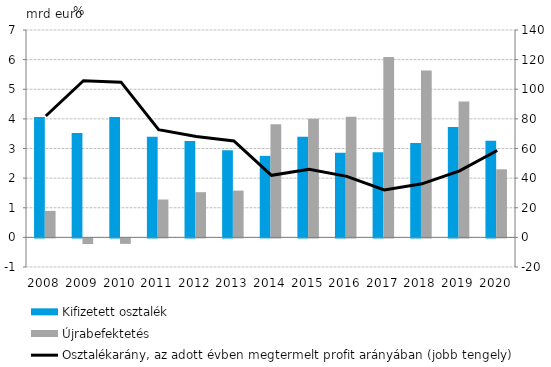
| Category | Kifizetett osztalék | Újrabefektetés |
|---|---|---|
| 2008.0 | 4.064 | 0.895 |
| 2009.0 | 3.522 | -0.192 |
| 2010.0 | 4.061 | -0.186 |
| 2011.0 | 3.399 | 1.278 |
| 2012.0 | 3.253 | 1.525 |
| 2013.0 | 2.94 | 1.578 |
| 2014.0 | 2.751 | 3.816 |
| 2015.0 | 3.396 | 4.002 |
| 2016.0 | 2.853 | 4.073 |
| 2017.0 | 2.872 | 6.088 |
| 2018.0 | 3.188 | 5.635 |
| 2019.0 | 3.729 | 4.586 |
| 2020.0 | 3.258 | 2.298 |